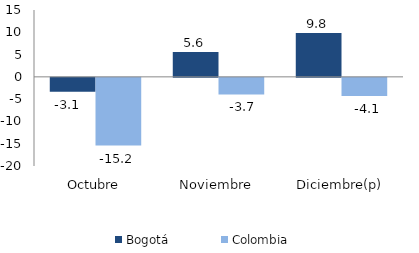
| Category | Bogotá | Colombia |
|---|---|---|
| Octubre | -3.094 | -15.192 |
| Noviembre | 5.604 | -3.724 |
| Diciembre(p) | 9.832 | -4.058 |